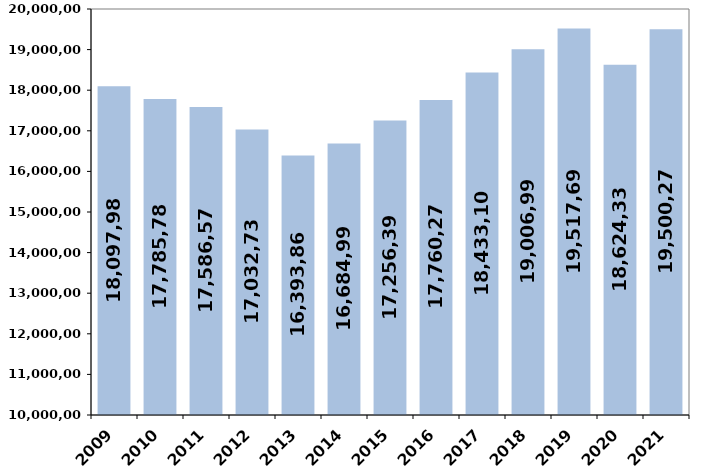
| Category | % de variación
 interanual |
|---|---|
| 2009 | 18097986.04 |
| 2010 | 17785781.72 |
| 2011 | 17586578.68 |
| 2012 | 17032738.45 |
| 2013 | 16393865.5 |
| 2014 | 16684995.09 |
| 2015 | 17256395.45 |
| 2016 | 17760271.11 |
| 2017 | 18433106.51 |
| 2018 | 19006990.19 |
| 2019 | 19517697 |
| 2020 | 18624336.682 |
| 2021 | 19500277.409 |